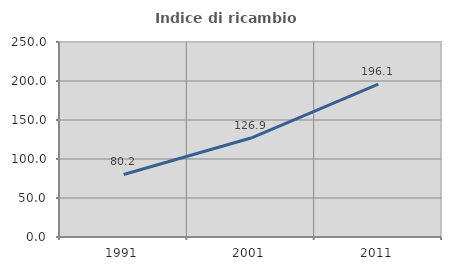
| Category | Indice di ricambio occupazionale  |
|---|---|
| 1991.0 | 80.198 |
| 2001.0 | 126.894 |
| 2011.0 | 196.078 |